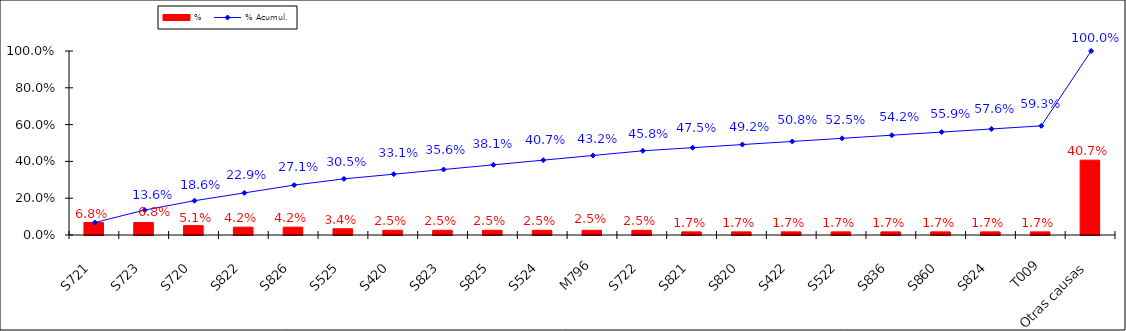
| Category | % |
|---|---|
| S721 | 0.068 |
| S723 | 0.068 |
| S720 | 0.051 |
| S822 | 0.042 |
| S826 | 0.042 |
| S525 | 0.034 |
| S420 | 0.025 |
| S823 | 0.025 |
| S825 | 0.025 |
| S524 | 0.025 |
| M796 | 0.025 |
| S722 | 0.025 |
| S821 | 0.017 |
| S820 | 0.017 |
| S422 | 0.017 |
| S522 | 0.017 |
| S836 | 0.017 |
| S860 | 0.017 |
| S824 | 0.017 |
| T009 | 0.017 |
| Otras causas | 0.407 |